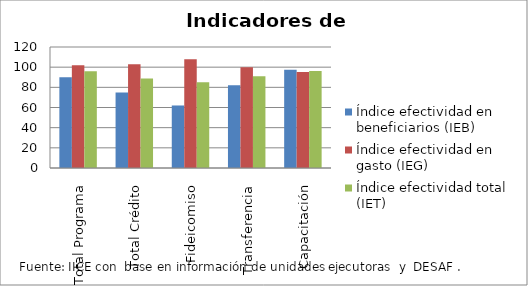
| Category | Índice efectividad en beneficiarios (IEB) | Índice efectividad en gasto (IEG)  | Índice efectividad total (IET) |
|---|---|---|---|
| Total Programa | 90.05 | 101.778 | 95.914 |
| Total Crédito | 74.79 | 102.848 | 88.819 |
| Fideicomiso | 62 | 107.905 | 84.953 |
| Transferencia | 81.989 | 100.001 | 90.995 |
| Capacitación | 97.314 | 95.098 | 96.206 |